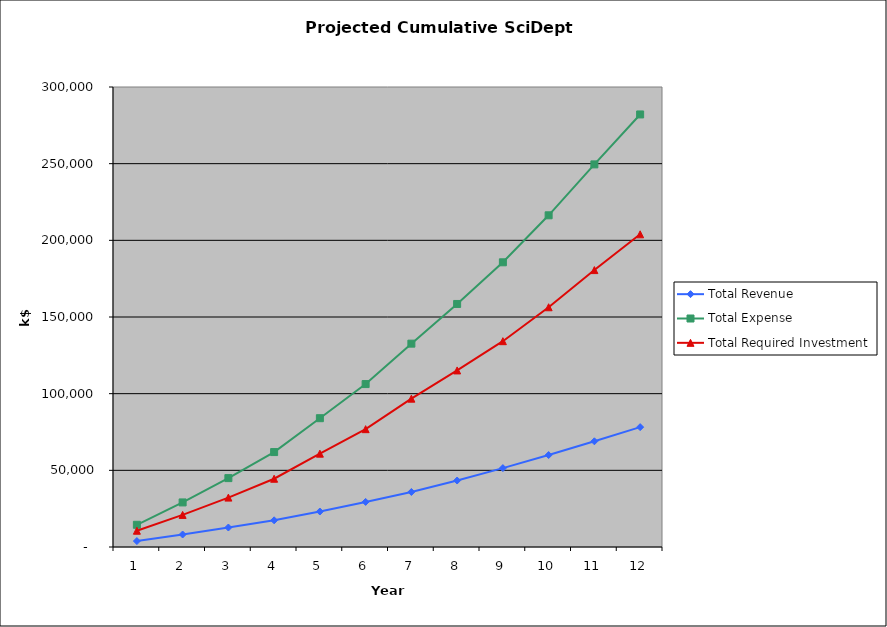
| Category | Total Revenue | Total Expense | Total Required Investment |
|---|---|---|---|
| 0 | 3867.473 | 14483.226 | 10615.753 |
| 1 | 8149.002 | 29070.937 | 20921.935 |
| 2 | 12705.971 | 44919.916 | 32213.945 |
| 3 | 17398.689 | 61913.923 | 44515.234 |
| 4 | 23133.049 | 84000.497 | 60867.448 |
| 5 | 29409.268 | 106259.907 | 76850.639 |
| 6 | 35876.004 | 132621.296 | 96745.293 |
| 7 | 43352.505 | 158503.522 | 115151.017 |
| 8 | 51441.582 | 185671.219 | 134229.637 |
| 9 | 59961.558 | 216319.853 | 156358.295 |
| 10 | 68931.489 | 249524.122 | 180592.634 |
| 11 | 78177.618 | 282097.879 | 203920.261 |